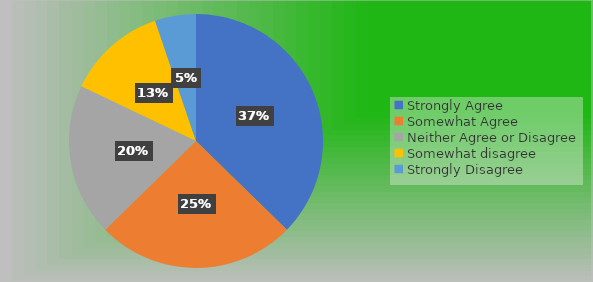
| Category | Series 0 |
|---|---|
| Strongly Agree | 50 |
| Somewhat Agree | 34 |
| Neither Agree or Disagree | 26 |
| Somewhat disagree | 17 |
| Strongly Disagree | 7 |